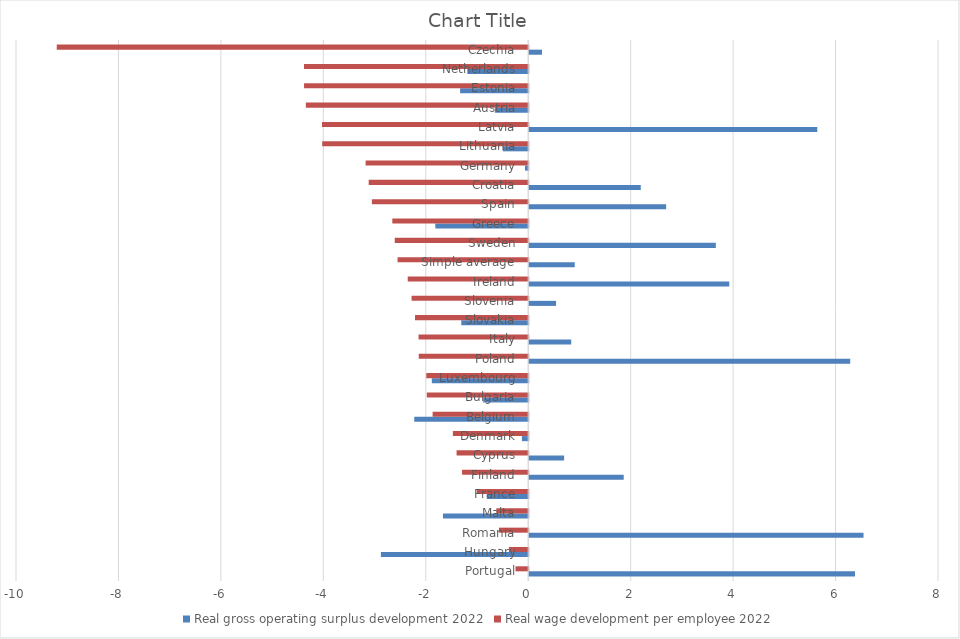
| Category | Real gross operating surplus development 2022 | Real wage development per employee 2022 |
|---|---|---|
| Portugal | 6.36 | -0.248 |
| Hungary | -2.876 | -0.377 |
| Romania | 6.527 | -0.57 |
| Malta | -1.665 | -0.622 |
| France | -0.809 | -1.005 |
| Finland | 1.845 | -1.292 |
| Cyprus | 0.681 | -1.399 |
| Denmark | -0.123 | -1.471 |
| Belgium | -2.225 | -1.867 |
| Bulgaria | -0.878 | -1.98 |
| Luxembourg | -1.882 | -1.99 |
| Poland | 6.267 | -2.137 |
| Italy | 0.82 | -2.141 |
| Slovakia | -1.307 | -2.21 |
| Slovenia | 0.524 | -2.277 |
| Ireland | 3.906 | -2.352 |
| Simple average | 0.888 | -2.551 |
| Sweden | 3.643 | -2.605 |
| Greece | -1.814 | -2.653 |
| Spain | 2.673 | -3.052 |
| Croatia | 2.178 | -3.114 |
| Germany | -0.063 | -3.175 |
| Lithuania | -0.498 | -4.022 |
| Latvia | 5.624 | -4.026 |
| Austria | -0.65 | -4.341 |
| Estonia | -1.329 | -4.377 |
| Netherlands | -1.189 | -4.378 |
| Czechia | 0.25 | -9.205 |